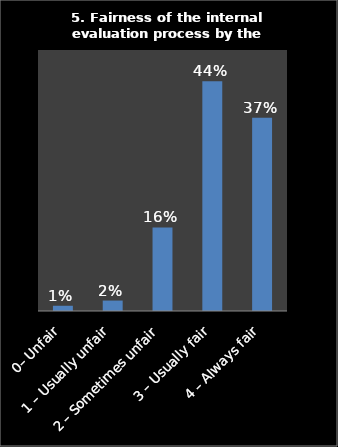
| Category | Series 0 |
|---|---|
| 0– Unfair | 0.01 |
| 1 – Usually unfair | 0.02 |
| 2 – Sometimes unfair | 0.16 |
| 3 – Usually fair | 0.44 |
| 4 – Always fair | 0.37 |